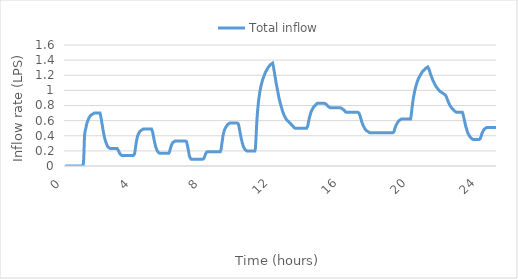
| Category | Total inflow |
|---|---|
| 0.0 | 0 |
| 0.016666666666666666 | 0 |
| 0.03333333333333333 | 0 |
| 0.05 | 0 |
| 0.06666666666666667 | 0 |
| 0.08333333333333333 | 0 |
| 0.09999999999999999 | 0 |
| 0.11666666666666665 | 0 |
| 0.13333333333333333 | 0 |
| 0.15 | 0 |
| 0.16666666666666666 | 0 |
| 0.18333333333333332 | 0 |
| 0.19999999999999998 | 0 |
| 0.21666666666666665 | 0 |
| 0.2333333333333333 | 0 |
| 0.24999999999999997 | 0 |
| 0.26666666666666666 | 0 |
| 0.2833333333333333 | 0 |
| 0.3 | 0 |
| 0.31666666666666665 | 0 |
| 0.3333333333333333 | 0 |
| 0.35 | 0 |
| 0.36666666666666664 | 0 |
| 0.3833333333333333 | 0 |
| 0.39999999999999997 | 0 |
| 0.41666666666666663 | 0 |
| 0.4333333333333333 | 0 |
| 0.44999999999999996 | 0 |
| 0.4666666666666666 | 0 |
| 0.4833333333333333 | 0 |
| 0.49999999999999994 | 0 |
| 0.5166666666666666 | 0 |
| 0.5333333333333333 | 0 |
| 0.55 | 0 |
| 0.5666666666666668 | 0 |
| 0.5833333333333335 | 0 |
| 0.6000000000000002 | 0 |
| 0.6166666666666669 | 0 |
| 0.6333333333333336 | 0 |
| 0.6500000000000004 | 0 |
| 0.6666666666666671 | 0 |
| 0.6833333333333338 | 0 |
| 0.7000000000000005 | 0 |
| 0.7166666666666672 | 0 |
| 0.733333333333334 | 0 |
| 0.7500000000000007 | 0 |
| 0.7666666666666674 | 0 |
| 0.7833333333333341 | 0 |
| 0.8000000000000008 | 0 |
| 0.8166666666666675 | 0 |
| 0.8333333333333343 | 0 |
| 0.850000000000001 | 0 |
| 0.8666666666666677 | 0 |
| 0.8833333333333344 | 0 |
| 0.9000000000000011 | 0 |
| 0.9166666666666679 | 0 |
| 0.9333333333333346 | 0 |
| 0.9500000000000013 | 0 |
| 0.966666666666668 | 0 |
| 0.9833333333333347 | 0 |
| 1.0000000000000013 | 0 |
| 1.016666666666668 | 0 |
| 1.0333333333333345 | 0.01 |
| 1.0500000000000012 | 0.02 |
| 1.0666666666666678 | 0.06 |
| 1.0833333333333344 | 0.14 |
| 1.100000000000001 | 0.25 |
| 1.1166666666666676 | 0.37 |
| 1.1333333333333342 | 0.43 |
| 1.1500000000000008 | 0.45 |
| 1.1666666666666674 | 0.47 |
| 1.183333333333334 | 0.48 |
| 1.2000000000000006 | 0.5 |
| 1.2166666666666672 | 0.52 |
| 1.2333333333333338 | 0.54 |
| 1.2500000000000004 | 0.55 |
| 1.266666666666667 | 0.57 |
| 1.2833333333333337 | 0.58 |
| 1.3000000000000003 | 0.59 |
| 1.3166666666666669 | 0.6 |
| 1.3333333333333335 | 0.61 |
| 1.35 | 0.62 |
| 1.3666666666666667 | 0.63 |
| 1.3833333333333333 | 0.63 |
| 1.4 | 0.64 |
| 1.4166666666666665 | 0.65 |
| 1.4333333333333331 | 0.65 |
| 1.4499999999999997 | 0.66 |
| 1.4666666666666663 | 0.66 |
| 1.483333333333333 | 0.67 |
| 1.4999999999999996 | 0.67 |
| 1.5166666666666662 | 0.68 |
| 1.5333333333333328 | 0.68 |
| 1.5499999999999994 | 0.68 |
| 1.566666666666666 | 0.69 |
| 1.5833333333333326 | 0.69 |
| 1.5999999999999992 | 0.69 |
| 1.6166666666666658 | 0.69 |
| 1.6333333333333324 | 0.7 |
| 1.649999999999999 | 0.7 |
| 1.6666666666666656 | 0.7 |
| 1.6833333333333322 | 0.7 |
| 1.6999999999999988 | 0.7 |
| 1.7166666666666655 | 0.7 |
| 1.733333333333332 | 0.7 |
| 1.7499999999999987 | 0.7 |
| 1.7666666666666653 | 0.7 |
| 1.7833333333333319 | 0.7 |
| 1.7999999999999985 | 0.7 |
| 1.816666666666665 | 0.7 |
| 1.8333333333333317 | 0.7 |
| 1.8499999999999983 | 0.7 |
| 1.866666666666665 | 0.7 |
| 1.8833333333333315 | 0.7 |
| 1.8999999999999981 | 0.7 |
| 1.9166666666666647 | 0.7 |
| 1.9333333333333313 | 0.7 |
| 1.949999999999998 | 0.7 |
| 1.9666666666666646 | 0.7 |
| 1.9833333333333312 | 0.7 |
| 1.9999999999999978 | 0.7 |
| 2.0166666666666644 | 0.7 |
| 2.033333333333331 | 0.69 |
| 2.0499999999999976 | 0.67 |
| 2.066666666666664 | 0.65 |
| 2.083333333333331 | 0.63 |
| 2.0999999999999974 | 0.61 |
| 2.116666666666664 | 0.58 |
| 2.1333333333333306 | 0.56 |
| 2.1499999999999972 | 0.54 |
| 2.166666666666664 | 0.52 |
| 2.1833333333333305 | 0.49 |
| 2.199999999999997 | 0.47 |
| 2.2166666666666637 | 0.45 |
| 2.2333333333333303 | 0.43 |
| 2.249999999999997 | 0.41 |
| 2.2666666666666635 | 0.39 |
| 2.28333333333333 | 0.38 |
| 2.2999999999999967 | 0.36 |
| 2.3166666666666633 | 0.35 |
| 2.33333333333333 | 0.33 |
| 2.3499999999999965 | 0.32 |
| 2.366666666666663 | 0.31 |
| 2.3833333333333298 | 0.3 |
| 2.3999999999999964 | 0.29 |
| 2.416666666666663 | 0.28 |
| 2.4333333333333296 | 0.27 |
| 2.449999999999996 | 0.26 |
| 2.466666666666663 | 0.26 |
| 2.4833333333333294 | 0.25 |
| 2.499999999999996 | 0.25 |
| 2.5166666666666626 | 0.25 |
| 2.533333333333329 | 0.24 |
| 2.549999999999996 | 0.24 |
| 2.5666666666666624 | 0.24 |
| 2.583333333333329 | 0.24 |
| 2.5999999999999956 | 0.23 |
| 2.6166666666666623 | 0.23 |
| 2.633333333333329 | 0.23 |
| 2.6499999999999955 | 0.23 |
| 2.666666666666662 | 0.23 |
| 2.6833333333333287 | 0.23 |
| 2.6999999999999953 | 0.23 |
| 2.716666666666662 | 0.23 |
| 2.7333333333333285 | 0.23 |
| 2.749999999999995 | 0.23 |
| 2.7666666666666617 | 0.23 |
| 2.7833333333333283 | 0.23 |
| 2.799999999999995 | 0.23 |
| 2.8166666666666615 | 0.23 |
| 2.833333333333328 | 0.23 |
| 2.8499999999999948 | 0.23 |
| 2.8666666666666614 | 0.23 |
| 2.883333333333328 | 0.23 |
| 2.8999999999999946 | 0.23 |
| 2.916666666666661 | 0.23 |
| 2.933333333333328 | 0.23 |
| 2.9499999999999944 | 0.23 |
| 2.966666666666661 | 0.23 |
| 2.9833333333333276 | 0.23 |
| 2.9999999999999942 | 0.23 |
| 3.016666666666661 | 0.23 |
| 3.0333333333333274 | 0.23 |
| 3.049999999999994 | 0.22 |
| 3.0666666666666607 | 0.21 |
| 3.0833333333333273 | 0.2 |
| 3.099999999999994 | 0.2 |
| 3.1166666666666605 | 0.19 |
| 3.133333333333327 | 0.18 |
| 3.1499999999999937 | 0.17 |
| 3.1666666666666603 | 0.17 |
| 3.183333333333327 | 0.16 |
| 3.1999999999999935 | 0.16 |
| 3.21666666666666 | 0.15 |
| 3.2333333333333267 | 0.15 |
| 3.2499999999999933 | 0.15 |
| 3.26666666666666 | 0.15 |
| 3.2833333333333266 | 0.14 |
| 3.299999999999993 | 0.14 |
| 3.3166666666666598 | 0.14 |
| 3.3333333333333264 | 0.14 |
| 3.349999999999993 | 0.14 |
| 3.3666666666666596 | 0.14 |
| 3.383333333333326 | 0.14 |
| 3.399999999999993 | 0.14 |
| 3.4166666666666594 | 0.14 |
| 3.433333333333326 | 0.14 |
| 3.4499999999999926 | 0.14 |
| 3.4666666666666592 | 0.14 |
| 3.483333333333326 | 0.14 |
| 3.4999999999999925 | 0.14 |
| 3.516666666666659 | 0.14 |
| 3.5333333333333257 | 0.14 |
| 3.5499999999999923 | 0.14 |
| 3.566666666666659 | 0.14 |
| 3.5833333333333255 | 0.14 |
| 3.599999999999992 | 0.14 |
| 3.6166666666666587 | 0.14 |
| 3.6333333333333253 | 0.14 |
| 3.649999999999992 | 0.14 |
| 3.6666666666666585 | 0.14 |
| 3.683333333333325 | 0.14 |
| 3.6999999999999917 | 0.14 |
| 3.7166666666666583 | 0.14 |
| 3.733333333333325 | 0.14 |
| 3.7499999999999916 | 0.14 |
| 3.766666666666658 | 0.14 |
| 3.7833333333333248 | 0.14 |
| 3.7999999999999914 | 0.14 |
| 3.816666666666658 | 0.14 |
| 3.8333333333333246 | 0.14 |
| 3.849999999999991 | 0.14 |
| 3.866666666666658 | 0.14 |
| 3.8833333333333244 | 0.14 |
| 3.899999999999991 | 0.14 |
| 3.9166666666666576 | 0.14 |
| 3.9333333333333242 | 0.14 |
| 3.949999999999991 | 0.14 |
| 3.9666666666666575 | 0.14 |
| 3.983333333333324 | 0.14 |
| 3.9999999999999907 | 0.15 |
| 4.016666666666658 | 0.16 |
| 4.033333333333324 | 0.17 |
| 4.049999999999991 | 0.2 |
| 4.0666666666666575 | 0.23 |
| 4.083333333333324 | 0.26 |
| 4.099999999999991 | 0.28 |
| 4.116666666666657 | 0.31 |
| 4.133333333333324 | 0.33 |
| 4.149999999999991 | 0.35 |
| 4.166666666666657 | 0.37 |
| 4.183333333333324 | 0.38 |
| 4.19999999999999 | 0.4 |
| 4.216666666666657 | 0.41 |
| 4.233333333333324 | 0.42 |
| 4.24999999999999 | 0.43 |
| 4.266666666666657 | 0.43 |
| 4.2833333333333234 | 0.44 |
| 4.29999999999999 | 0.45 |
| 4.316666666666657 | 0.45 |
| 4.333333333333323 | 0.46 |
| 4.34999999999999 | 0.46 |
| 4.3666666666666565 | 0.47 |
| 4.383333333333323 | 0.47 |
| 4.39999999999999 | 0.47 |
| 4.416666666666656 | 0.48 |
| 4.433333333333323 | 0.48 |
| 4.4499999999999895 | 0.48 |
| 4.466666666666656 | 0.48 |
| 4.483333333333323 | 0.49 |
| 4.499999999999989 | 0.49 |
| 4.516666666666656 | 0.49 |
| 4.533333333333323 | 0.49 |
| 4.549999999999989 | 0.49 |
| 4.566666666666656 | 0.49 |
| 4.583333333333322 | 0.49 |
| 4.599999999999989 | 0.49 |
| 4.616666666666656 | 0.49 |
| 4.633333333333322 | 0.49 |
| 4.649999999999989 | 0.49 |
| 4.666666666666655 | 0.49 |
| 4.683333333333322 | 0.49 |
| 4.699999999999989 | 0.49 |
| 4.716666666666655 | 0.49 |
| 4.733333333333322 | 0.49 |
| 4.7499999999999885 | 0.49 |
| 4.766666666666655 | 0.49 |
| 4.783333333333322 | 0.49 |
| 4.799999999999988 | 0.49 |
| 4.816666666666655 | 0.49 |
| 4.8333333333333215 | 0.49 |
| 4.849999999999988 | 0.49 |
| 4.866666666666655 | 0.49 |
| 4.883333333333321 | 0.49 |
| 4.899999999999988 | 0.49 |
| 4.9166666666666545 | 0.49 |
| 4.933333333333321 | 0.49 |
| 4.949999999999988 | 0.49 |
| 4.966666666666654 | 0.49 |
| 4.983333333333321 | 0.49 |
| 4.999999999999988 | 0.49 |
| 5.016666666666654 | 0.48 |
| 5.033333333333321 | 0.47 |
| 5.049999999999987 | 0.46 |
| 5.066666666666654 | 0.45 |
| 5.083333333333321 | 0.43 |
| 5.099999999999987 | 0.41 |
| 5.116666666666654 | 0.39 |
| 5.13333333333332 | 0.37 |
| 5.149999999999987 | 0.35 |
| 5.166666666666654 | 0.33 |
| 5.18333333333332 | 0.31 |
| 5.199999999999987 | 0.3 |
| 5.2166666666666535 | 0.28 |
| 5.23333333333332 | 0.26 |
| 5.249999999999987 | 0.25 |
| 5.266666666666653 | 0.24 |
| 5.28333333333332 | 0.23 |
| 5.2999999999999865 | 0.22 |
| 5.316666666666653 | 0.21 |
| 5.33333333333332 | 0.2 |
| 5.349999999999986 | 0.2 |
| 5.366666666666653 | 0.19 |
| 5.3833333333333195 | 0.19 |
| 5.399999999999986 | 0.18 |
| 5.416666666666653 | 0.18 |
| 5.433333333333319 | 0.18 |
| 5.449999999999986 | 0.18 |
| 5.466666666666653 | 0.17 |
| 5.483333333333319 | 0.17 |
| 5.499999999999986 | 0.17 |
| 5.516666666666652 | 0.17 |
| 5.533333333333319 | 0.17 |
| 5.549999999999986 | 0.17 |
| 5.566666666666652 | 0.17 |
| 5.583333333333319 | 0.17 |
| 5.599999999999985 | 0.17 |
| 5.616666666666652 | 0.17 |
| 5.633333333333319 | 0.17 |
| 5.649999999999985 | 0.17 |
| 5.666666666666652 | 0.17 |
| 5.6833333333333185 | 0.17 |
| 5.699999999999985 | 0.17 |
| 5.716666666666652 | 0.17 |
| 5.733333333333318 | 0.17 |
| 5.749999999999985 | 0.17 |
| 5.7666666666666515 | 0.17 |
| 5.783333333333318 | 0.17 |
| 5.799999999999985 | 0.17 |
| 5.816666666666651 | 0.17 |
| 5.833333333333318 | 0.17 |
| 5.8499999999999845 | 0.17 |
| 5.866666666666651 | 0.17 |
| 5.883333333333318 | 0.17 |
| 5.899999999999984 | 0.17 |
| 5.916666666666651 | 0.17 |
| 5.933333333333318 | 0.17 |
| 5.949999999999984 | 0.17 |
| 5.966666666666651 | 0.17 |
| 5.983333333333317 | 0.17 |
| 5.999999999999984 | 0.17 |
| 6.016666666666651 | 0.18 |
| 6.033333333333317 | 0.18 |
| 6.049999999999984 | 0.19 |
| 6.06666666666665 | 0.21 |
| 6.083333333333317 | 0.22 |
| 6.099999999999984 | 0.23 |
| 6.11666666666665 | 0.25 |
| 6.133333333333317 | 0.26 |
| 6.1499999999999835 | 0.27 |
| 6.16666666666665 | 0.28 |
| 6.183333333333317 | 0.29 |
| 6.199999999999983 | 0.29 |
| 6.21666666666665 | 0.3 |
| 6.2333333333333165 | 0.31 |
| 6.249999999999983 | 0.31 |
| 6.26666666666665 | 0.31 |
| 6.283333333333316 | 0.32 |
| 6.299999999999983 | 0.32 |
| 6.3166666666666496 | 0.32 |
| 6.333333333333316 | 0.32 |
| 6.349999999999983 | 0.33 |
| 6.366666666666649 | 0.33 |
| 6.383333333333316 | 0.33 |
| 6.399999999999983 | 0.33 |
| 6.416666666666649 | 0.33 |
| 6.433333333333316 | 0.33 |
| 6.449999999999982 | 0.33 |
| 6.466666666666649 | 0.33 |
| 6.483333333333316 | 0.33 |
| 6.499999999999982 | 0.33 |
| 6.516666666666649 | 0.33 |
| 6.5333333333333155 | 0.33 |
| 6.549999999999982 | 0.33 |
| 6.566666666666649 | 0.33 |
| 6.583333333333315 | 0.33 |
| 6.599999999999982 | 0.33 |
| 6.6166666666666485 | 0.33 |
| 6.633333333333315 | 0.33 |
| 6.649999999999982 | 0.33 |
| 6.666666666666648 | 0.33 |
| 6.683333333333315 | 0.33 |
| 6.6999999999999815 | 0.33 |
| 6.716666666666648 | 0.33 |
| 6.733333333333315 | 0.33 |
| 6.749999999999981 | 0.33 |
| 6.766666666666648 | 0.33 |
| 6.783333333333315 | 0.33 |
| 6.799999999999981 | 0.33 |
| 6.816666666666648 | 0.33 |
| 6.833333333333314 | 0.33 |
| 6.849999999999981 | 0.33 |
| 6.866666666666648 | 0.33 |
| 6.883333333333314 | 0.33 |
| 6.899999999999981 | 0.33 |
| 6.916666666666647 | 0.33 |
| 6.933333333333314 | 0.33 |
| 6.949999999999981 | 0.33 |
| 6.966666666666647 | 0.33 |
| 6.983333333333314 | 0.33 |
| 6.9999999999999805 | 0.33 |
| 7.016666666666647 | 0.32 |
| 7.033333333333314 | 0.32 |
| 7.04999999999998 | 0.3 |
| 7.066666666666647 | 0.29 |
| 7.0833333333333135 | 0.27 |
| 7.09999999999998 | 0.25 |
| 7.116666666666647 | 0.23 |
| 7.133333333333313 | 0.21 |
| 7.14999999999998 | 0.19 |
| 7.1666666666666465 | 0.17 |
| 7.183333333333313 | 0.15 |
| 7.19999999999998 | 0.13 |
| 7.216666666666646 | 0.12 |
| 7.233333333333313 | 0.11 |
| 7.24999999999998 | 0.11 |
| 7.266666666666646 | 0.1 |
| 7.283333333333313 | 0.1 |
| 7.299999999999979 | 0.09 |
| 7.316666666666646 | 0.09 |
| 7.333333333333313 | 0.09 |
| 7.349999999999979 | 0.09 |
| 7.366666666666646 | 0.09 |
| 7.383333333333312 | 0.09 |
| 7.399999999999979 | 0.09 |
| 7.416666666666646 | 0.09 |
| 7.433333333333312 | 0.09 |
| 7.449999999999979 | 0.09 |
| 7.4666666666666455 | 0.09 |
| 7.483333333333312 | 0.09 |
| 7.499999999999979 | 0.09 |
| 7.516666666666645 | 0.09 |
| 7.533333333333312 | 0.09 |
| 7.5499999999999785 | 0.09 |
| 7.566666666666645 | 0.09 |
| 7.583333333333312 | 0.09 |
| 7.599999999999978 | 0.09 |
| 7.616666666666645 | 0.09 |
| 7.6333333333333115 | 0.09 |
| 7.649999999999978 | 0.09 |
| 7.666666666666645 | 0.09 |
| 7.683333333333311 | 0.09 |
| 7.699999999999978 | 0.09 |
| 7.716666666666645 | 0.09 |
| 7.733333333333311 | 0.09 |
| 7.749999999999978 | 0.09 |
| 7.766666666666644 | 0.09 |
| 7.783333333333311 | 0.09 |
| 7.799999999999978 | 0.09 |
| 7.816666666666644 | 0.09 |
| 7.833333333333311 | 0.09 |
| 7.849999999999977 | 0.09 |
| 7.866666666666644 | 0.09 |
| 7.883333333333311 | 0.09 |
| 7.899999999999977 | 0.09 |
| 7.916666666666644 | 0.09 |
| 7.9333333333333105 | 0.09 |
| 7.949999999999977 | 0.09 |
| 7.966666666666644 | 0.09 |
| 7.98333333333331 | 0.09 |
| 7.999999999999977 | 0.09 |
| 8.016666666666644 | 0.09 |
| 8.033333333333312 | 0.1 |
| 8.04999999999998 | 0.11 |
| 8.066666666666647 | 0.12 |
| 8.083333333333314 | 0.13 |
| 8.099999999999982 | 0.14 |
| 8.11666666666665 | 0.15 |
| 8.133333333333317 | 0.16 |
| 8.149999999999984 | 0.17 |
| 8.166666666666652 | 0.17 |
| 8.18333333333332 | 0.18 |
| 8.199999999999987 | 0.18 |
| 8.216666666666654 | 0.18 |
| 8.233333333333322 | 0.19 |
| 8.24999999999999 | 0.19 |
| 8.266666666666657 | 0.19 |
| 8.283333333333324 | 0.19 |
| 8.299999999999992 | 0.19 |
| 8.31666666666666 | 0.19 |
| 8.333333333333327 | 0.19 |
| 8.349999999999994 | 0.19 |
| 8.366666666666662 | 0.19 |
| 8.38333333333333 | 0.19 |
| 8.399999999999997 | 0.19 |
| 8.416666666666664 | 0.19 |
| 8.433333333333332 | 0.19 |
| 8.45 | 0.19 |
| 8.466666666666667 | 0.19 |
| 8.483333333333334 | 0.19 |
| 8.500000000000002 | 0.19 |
| 8.51666666666667 | 0.19 |
| 8.533333333333337 | 0.19 |
| 8.550000000000004 | 0.19 |
| 8.566666666666672 | 0.19 |
| 8.58333333333334 | 0.19 |
| 8.600000000000007 | 0.19 |
| 8.616666666666674 | 0.19 |
| 8.633333333333342 | 0.19 |
| 8.65000000000001 | 0.19 |
| 8.666666666666677 | 0.19 |
| 8.683333333333344 | 0.19 |
| 8.700000000000012 | 0.19 |
| 8.71666666666668 | 0.19 |
| 8.733333333333347 | 0.19 |
| 8.750000000000014 | 0.19 |
| 8.766666666666682 | 0.19 |
| 8.78333333333335 | 0.19 |
| 8.800000000000017 | 0.19 |
| 8.816666666666684 | 0.19 |
| 8.833333333333352 | 0.19 |
| 8.85000000000002 | 0.19 |
| 8.866666666666687 | 0.19 |
| 8.883333333333354 | 0.19 |
| 8.900000000000022 | 0.19 |
| 8.91666666666669 | 0.19 |
| 8.933333333333357 | 0.19 |
| 8.950000000000024 | 0.19 |
| 8.966666666666692 | 0.19 |
| 8.98333333333336 | 0.19 |
| 9.000000000000027 | 0.19 |
| 9.016666666666694 | 0.2 |
| 9.033333333333362 | 0.22 |
| 9.05000000000003 | 0.25 |
| 9.066666666666697 | 0.28 |
| 9.083333333333364 | 0.31 |
| 9.100000000000032 | 0.33 |
| 9.1166666666667 | 0.36 |
| 9.133333333333367 | 0.39 |
| 9.150000000000034 | 0.41 |
| 9.166666666666702 | 0.42 |
| 9.183333333333369 | 0.44 |
| 9.200000000000037 | 0.45 |
| 9.216666666666704 | 0.47 |
| 9.233333333333372 | 0.48 |
| 9.250000000000039 | 0.49 |
| 9.266666666666707 | 0.5 |
| 9.283333333333374 | 0.5 |
| 9.300000000000042 | 0.51 |
| 9.316666666666709 | 0.52 |
| 9.333333333333377 | 0.52 |
| 9.350000000000044 | 0.53 |
| 9.366666666666712 | 0.54 |
| 9.383333333333379 | 0.54 |
| 9.400000000000047 | 0.54 |
| 9.416666666666714 | 0.55 |
| 9.433333333333382 | 0.55 |
| 9.450000000000049 | 0.55 |
| 9.466666666666717 | 0.56 |
| 9.483333333333384 | 0.56 |
| 9.500000000000052 | 0.56 |
| 9.516666666666719 | 0.57 |
| 9.533333333333387 | 0.57 |
| 9.550000000000054 | 0.57 |
| 9.566666666666721 | 0.57 |
| 9.583333333333389 | 0.57 |
| 9.600000000000056 | 0.57 |
| 9.616666666666724 | 0.57 |
| 9.633333333333391 | 0.57 |
| 9.650000000000059 | 0.57 |
| 9.666666666666726 | 0.57 |
| 9.683333333333394 | 0.57 |
| 9.700000000000061 | 0.57 |
| 9.716666666666729 | 0.57 |
| 9.733333333333396 | 0.57 |
| 9.750000000000064 | 0.57 |
| 9.766666666666731 | 0.57 |
| 9.783333333333399 | 0.57 |
| 9.800000000000066 | 0.57 |
| 9.816666666666734 | 0.57 |
| 9.833333333333401 | 0.57 |
| 9.850000000000069 | 0.57 |
| 9.866666666666736 | 0.57 |
| 9.883333333333404 | 0.57 |
| 9.900000000000071 | 0.57 |
| 9.916666666666739 | 0.57 |
| 9.933333333333406 | 0.57 |
| 9.950000000000074 | 0.57 |
| 9.966666666666741 | 0.57 |
| 9.983333333333409 | 0.57 |
| 10.000000000000076 | 0.57 |
| 10.016666666666744 | 0.56 |
| 10.033333333333411 | 0.55 |
| 10.050000000000079 | 0.54 |
| 10.066666666666746 | 0.52 |
| 10.083333333333414 | 0.5 |
| 10.100000000000081 | 0.48 |
| 10.116666666666749 | 0.46 |
| 10.133333333333416 | 0.44 |
| 10.150000000000084 | 0.42 |
| 10.166666666666751 | 0.4 |
| 10.183333333333419 | 0.38 |
| 10.200000000000086 | 0.36 |
| 10.216666666666754 | 0.35 |
| 10.233333333333421 | 0.33 |
| 10.250000000000089 | 0.31 |
| 10.266666666666756 | 0.3 |
| 10.283333333333424 | 0.29 |
| 10.300000000000091 | 0.27 |
| 10.316666666666759 | 0.26 |
| 10.333333333333426 | 0.25 |
| 10.350000000000094 | 0.24 |
| 10.366666666666761 | 0.24 |
| 10.383333333333429 | 0.23 |
| 10.400000000000096 | 0.23 |
| 10.416666666666764 | 0.22 |
| 10.433333333333431 | 0.22 |
| 10.450000000000099 | 0.21 |
| 10.466666666666766 | 0.21 |
| 10.483333333333434 | 0.21 |
| 10.500000000000101 | 0.21 |
| 10.516666666666769 | 0.2 |
| 10.533333333333436 | 0.2 |
| 10.550000000000104 | 0.2 |
| 10.566666666666771 | 0.2 |
| 10.583333333333439 | 0.2 |
| 10.600000000000106 | 0.2 |
| 10.616666666666774 | 0.2 |
| 10.633333333333441 | 0.2 |
| 10.650000000000109 | 0.2 |
| 10.666666666666776 | 0.2 |
| 10.683333333333444 | 0.2 |
| 10.700000000000111 | 0.2 |
| 10.716666666666779 | 0.2 |
| 10.733333333333446 | 0.2 |
| 10.750000000000114 | 0.2 |
| 10.766666666666781 | 0.2 |
| 10.783333333333449 | 0.2 |
| 10.800000000000116 | 0.2 |
| 10.816666666666784 | 0.2 |
| 10.833333333333451 | 0.2 |
| 10.850000000000119 | 0.2 |
| 10.866666666666786 | 0.2 |
| 10.883333333333454 | 0.2 |
| 10.900000000000121 | 0.2 |
| 10.916666666666789 | 0.2 |
| 10.933333333333456 | 0.2 |
| 10.950000000000124 | 0.2 |
| 10.966666666666791 | 0.2 |
| 10.983333333333459 | 0.2 |
| 11.000000000000126 | 0.21 |
| 11.016666666666794 | 0.23 |
| 11.033333333333461 | 0.29 |
| 11.050000000000129 | 0.36 |
| 11.066666666666796 | 0.44 |
| 11.083333333333464 | 0.52 |
| 11.100000000000131 | 0.58 |
| 11.116666666666799 | 0.64 |
| 11.133333333333466 | 0.7 |
| 11.150000000000134 | 0.74 |
| 11.166666666666801 | 0.78 |
| 11.183333333333469 | 0.82 |
| 11.200000000000136 | 0.86 |
| 11.216666666666804 | 0.89 |
| 11.233333333333471 | 0.91 |
| 11.250000000000139 | 0.94 |
| 11.266666666666806 | 0.97 |
| 11.283333333333474 | 0.99 |
| 11.300000000000141 | 1.01 |
| 11.316666666666809 | 1.03 |
| 11.333333333333476 | 1.05 |
| 11.350000000000144 | 1.06 |
| 11.366666666666811 | 1.08 |
| 11.383333333333479 | 1.09 |
| 11.400000000000146 | 1.11 |
| 11.416666666666814 | 1.12 |
| 11.433333333333481 | 1.14 |
| 11.450000000000149 | 1.15 |
| 11.466666666666816 | 1.16 |
| 11.483333333333483 | 1.17 |
| 11.500000000000151 | 1.18 |
| 11.516666666666818 | 1.19 |
| 11.533333333333486 | 1.2 |
| 11.550000000000153 | 1.21 |
| 11.566666666666821 | 1.22 |
| 11.583333333333488 | 1.23 |
| 11.600000000000156 | 1.24 |
| 11.616666666666823 | 1.25 |
| 11.633333333333491 | 1.25 |
| 11.650000000000158 | 1.26 |
| 11.666666666666826 | 1.27 |
| 11.683333333333493 | 1.27 |
| 11.700000000000161 | 1.28 |
| 11.716666666666828 | 1.29 |
| 11.733333333333496 | 1.29 |
| 11.750000000000163 | 1.3 |
| 11.766666666666831 | 1.3 |
| 11.783333333333498 | 1.31 |
| 11.800000000000166 | 1.31 |
| 11.816666666666833 | 1.32 |
| 11.833333333333501 | 1.32 |
| 11.850000000000168 | 1.33 |
| 11.866666666666836 | 1.33 |
| 11.883333333333503 | 1.34 |
| 11.90000000000017 | 1.34 |
| 11.916666666666838 | 1.35 |
| 11.933333333333506 | 1.35 |
| 11.950000000000173 | 1.35 |
| 11.96666666666684 | 1.36 |
| 11.983333333333508 | 1.36 |
| 12.000000000000176 | 1.36 |
| 12.016666666666843 | 1.36 |
| 12.03333333333351 | 1.34 |
| 12.050000000000178 | 1.33 |
| 12.066666666666846 | 1.31 |
| 12.083333333333513 | 1.28 |
| 12.10000000000018 | 1.26 |
| 12.116666666666848 | 1.24 |
| 12.133333333333516 | 1.21 |
| 12.150000000000183 | 1.19 |
| 12.16666666666685 | 1.17 |
| 12.183333333333518 | 1.15 |
| 12.200000000000186 | 1.12 |
| 12.216666666666853 | 1.1 |
| 12.23333333333352 | 1.08 |
| 12.250000000000188 | 1.06 |
| 12.266666666666856 | 1.04 |
| 12.283333333333523 | 1.02 |
| 12.30000000000019 | 1 |
| 12.316666666666858 | 0.98 |
| 12.333333333333526 | 0.96 |
| 12.350000000000193 | 0.94 |
| 12.36666666666686 | 0.92 |
| 12.383333333333528 | 0.9 |
| 12.400000000000196 | 0.89 |
| 12.416666666666863 | 0.87 |
| 12.43333333333353 | 0.86 |
| 12.450000000000198 | 0.84 |
| 12.466666666666866 | 0.82 |
| 12.483333333333533 | 0.81 |
| 12.5000000000002 | 0.8 |
| 12.516666666666868 | 0.78 |
| 12.533333333333536 | 0.77 |
| 12.550000000000203 | 0.76 |
| 12.56666666666687 | 0.74 |
| 12.583333333333538 | 0.73 |
| 12.600000000000206 | 0.72 |
| 12.616666666666873 | 0.71 |
| 12.63333333333354 | 0.7 |
| 12.650000000000208 | 0.69 |
| 12.666666666666876 | 0.68 |
| 12.683333333333543 | 0.67 |
| 12.70000000000021 | 0.66 |
| 12.716666666666878 | 0.66 |
| 12.733333333333546 | 0.65 |
| 12.750000000000213 | 0.64 |
| 12.76666666666688 | 0.64 |
| 12.783333333333548 | 0.63 |
| 12.800000000000216 | 0.62 |
| 12.816666666666883 | 0.62 |
| 12.83333333333355 | 0.61 |
| 12.850000000000218 | 0.61 |
| 12.866666666666886 | 0.6 |
| 12.883333333333553 | 0.6 |
| 12.90000000000022 | 0.59 |
| 12.916666666666888 | 0.59 |
| 12.933333333333556 | 0.59 |
| 12.950000000000223 | 0.58 |
| 12.96666666666689 | 0.58 |
| 12.983333333333558 | 0.58 |
| 13.000000000000226 | 0.57 |
| 13.016666666666893 | 0.57 |
| 13.03333333333356 | 0.57 |
| 13.050000000000228 | 0.56 |
| 13.066666666666896 | 0.56 |
| 13.083333333333563 | 0.55 |
| 13.10000000000023 | 0.55 |
| 13.116666666666898 | 0.54 |
| 13.133333333333566 | 0.54 |
| 13.150000000000233 | 0.53 |
| 13.1666666666669 | 0.53 |
| 13.183333333333568 | 0.53 |
| 13.200000000000236 | 0.52 |
| 13.216666666666903 | 0.52 |
| 13.23333333333357 | 0.52 |
| 13.250000000000238 | 0.51 |
| 13.266666666666906 | 0.51 |
| 13.283333333333573 | 0.51 |
| 13.30000000000024 | 0.51 |
| 13.316666666666908 | 0.5 |
| 13.333333333333576 | 0.5 |
| 13.350000000000243 | 0.5 |
| 13.36666666666691 | 0.5 |
| 13.383333333333578 | 0.5 |
| 13.400000000000245 | 0.5 |
| 13.416666666666913 | 0.5 |
| 13.43333333333358 | 0.5 |
| 13.450000000000248 | 0.5 |
| 13.466666666666915 | 0.5 |
| 13.483333333333583 | 0.5 |
| 13.50000000000025 | 0.5 |
| 13.516666666666918 | 0.5 |
| 13.533333333333585 | 0.5 |
| 13.550000000000253 | 0.5 |
| 13.56666666666692 | 0.5 |
| 13.583333333333588 | 0.5 |
| 13.600000000000255 | 0.5 |
| 13.616666666666923 | 0.5 |
| 13.63333333333359 | 0.5 |
| 13.650000000000258 | 0.5 |
| 13.666666666666925 | 0.5 |
| 13.683333333333593 | 0.5 |
| 13.70000000000026 | 0.5 |
| 13.716666666666928 | 0.5 |
| 13.733333333333595 | 0.5 |
| 13.750000000000263 | 0.5 |
| 13.76666666666693 | 0.5 |
| 13.783333333333598 | 0.5 |
| 13.800000000000265 | 0.5 |
| 13.816666666666933 | 0.5 |
| 13.8333333333336 | 0.5 |
| 13.850000000000268 | 0.5 |
| 13.866666666666935 | 0.5 |
| 13.883333333333603 | 0.5 |
| 13.90000000000027 | 0.5 |
| 13.916666666666938 | 0.5 |
| 13.933333333333605 | 0.5 |
| 13.950000000000273 | 0.5 |
| 13.96666666666694 | 0.5 |
| 13.983333333333608 | 0.5 |
| 14.000000000000275 | 0.5 |
| 14.016666666666943 | 0.51 |
| 14.03333333333361 | 0.52 |
| 14.050000000000278 | 0.53 |
| 14.066666666666945 | 0.55 |
| 14.083333333333613 | 0.57 |
| 14.10000000000028 | 0.59 |
| 14.116666666666948 | 0.61 |
| 14.133333333333615 | 0.63 |
| 14.150000000000283 | 0.64 |
| 14.16666666666695 | 0.66 |
| 14.183333333333618 | 0.67 |
| 14.200000000000285 | 0.68 |
| 14.216666666666953 | 0.69 |
| 14.23333333333362 | 0.71 |
| 14.250000000000288 | 0.72 |
| 14.266666666666955 | 0.73 |
| 14.283333333333623 | 0.73 |
| 14.30000000000029 | 0.74 |
| 14.316666666666958 | 0.75 |
| 14.333333333333625 | 0.76 |
| 14.350000000000293 | 0.76 |
| 14.36666666666696 | 0.77 |
| 14.383333333333628 | 0.78 |
| 14.400000000000295 | 0.78 |
| 14.416666666666963 | 0.79 |
| 14.43333333333363 | 0.79 |
| 14.450000000000298 | 0.8 |
| 14.466666666666965 | 0.8 |
| 14.483333333333633 | 0.8 |
| 14.5000000000003 | 0.81 |
| 14.516666666666968 | 0.81 |
| 14.533333333333635 | 0.81 |
| 14.550000000000303 | 0.82 |
| 14.56666666666697 | 0.82 |
| 14.583333333333638 | 0.82 |
| 14.600000000000305 | 0.83 |
| 14.616666666666973 | 0.83 |
| 14.63333333333364 | 0.83 |
| 14.650000000000308 | 0.83 |
| 14.666666666666975 | 0.83 |
| 14.683333333333643 | 0.83 |
| 14.70000000000031 | 0.83 |
| 14.716666666666978 | 0.83 |
| 14.733333333333645 | 0.83 |
| 14.750000000000313 | 0.83 |
| 14.76666666666698 | 0.83 |
| 14.783333333333648 | 0.83 |
| 14.800000000000315 | 0.83 |
| 14.816666666666983 | 0.83 |
| 14.83333333333365 | 0.83 |
| 14.850000000000318 | 0.83 |
| 14.866666666666985 | 0.83 |
| 14.883333333333653 | 0.83 |
| 14.90000000000032 | 0.83 |
| 14.916666666666988 | 0.83 |
| 14.933333333333655 | 0.83 |
| 14.950000000000323 | 0.83 |
| 14.96666666666699 | 0.83 |
| 14.983333333333658 | 0.83 |
| 15.000000000000325 | 0.83 |
| 15.016666666666993 | 0.83 |
| 15.03333333333366 | 0.83 |
| 15.050000000000328 | 0.83 |
| 15.066666666666995 | 0.83 |
| 15.083333333333663 | 0.82 |
| 15.10000000000033 | 0.82 |
| 15.116666666666998 | 0.82 |
| 15.133333333333665 | 0.81 |
| 15.150000000000333 | 0.81 |
| 15.166666666667 | 0.81 |
| 15.183333333333668 | 0.8 |
| 15.200000000000335 | 0.8 |
| 15.216666666667003 | 0.79 |
| 15.23333333333367 | 0.79 |
| 15.250000000000338 | 0.79 |
| 15.266666666667005 | 0.79 |
| 15.283333333333672 | 0.78 |
| 15.30000000000034 | 0.78 |
| 15.316666666667007 | 0.78 |
| 15.333333333333675 | 0.78 |
| 15.350000000000342 | 0.77 |
| 15.36666666666701 | 0.77 |
| 15.383333333333677 | 0.77 |
| 15.400000000000345 | 0.77 |
| 15.416666666667012 | 0.77 |
| 15.43333333333368 | 0.77 |
| 15.450000000000347 | 0.77 |
| 15.466666666667015 | 0.77 |
| 15.483333333333682 | 0.77 |
| 15.50000000000035 | 0.77 |
| 15.516666666667017 | 0.77 |
| 15.533333333333685 | 0.77 |
| 15.550000000000352 | 0.77 |
| 15.56666666666702 | 0.77 |
| 15.583333333333687 | 0.77 |
| 15.600000000000355 | 0.77 |
| 15.616666666667022 | 0.77 |
| 15.63333333333369 | 0.77 |
| 15.650000000000357 | 0.77 |
| 15.666666666667025 | 0.77 |
| 15.683333333333692 | 0.77 |
| 15.70000000000036 | 0.77 |
| 15.716666666667027 | 0.77 |
| 15.733333333333695 | 0.77 |
| 15.750000000000362 | 0.77 |
| 15.76666666666703 | 0.77 |
| 15.783333333333697 | 0.77 |
| 15.800000000000365 | 0.77 |
| 15.816666666667032 | 0.77 |
| 15.8333333333337 | 0.77 |
| 15.850000000000367 | 0.77 |
| 15.866666666667035 | 0.77 |
| 15.883333333333702 | 0.77 |
| 15.90000000000037 | 0.77 |
| 15.916666666667037 | 0.77 |
| 15.933333333333705 | 0.77 |
| 15.950000000000372 | 0.77 |
| 15.96666666666704 | 0.77 |
| 15.983333333333707 | 0.77 |
| 16.000000000000373 | 0.77 |
| 16.01666666666704 | 0.76 |
| 16.033333333333704 | 0.76 |
| 16.05000000000037 | 0.76 |
| 16.066666666667036 | 0.75 |
| 16.0833333333337 | 0.75 |
| 16.100000000000367 | 0.75 |
| 16.116666666667033 | 0.74 |
| 16.1333333333337 | 0.74 |
| 16.150000000000365 | 0.74 |
| 16.16666666666703 | 0.73 |
| 16.183333333333696 | 0.73 |
| 16.20000000000036 | 0.73 |
| 16.216666666667027 | 0.72 |
| 16.233333333333693 | 0.72 |
| 16.25000000000036 | 0.72 |
| 16.266666666667025 | 0.72 |
| 16.28333333333369 | 0.71 |
| 16.300000000000356 | 0.71 |
| 16.31666666666702 | 0.71 |
| 16.333333333333687 | 0.71 |
| 16.350000000000353 | 0.71 |
| 16.36666666666702 | 0.71 |
| 16.383333333333685 | 0.71 |
| 16.40000000000035 | 0.71 |
| 16.416666666667016 | 0.71 |
| 16.43333333333368 | 0.71 |
| 16.450000000000347 | 0.71 |
| 16.466666666667013 | 0.71 |
| 16.48333333333368 | 0.71 |
| 16.500000000000345 | 0.71 |
| 16.51666666666701 | 0.71 |
| 16.533333333333676 | 0.71 |
| 16.55000000000034 | 0.71 |
| 16.566666666667007 | 0.71 |
| 16.583333333333673 | 0.71 |
| 16.60000000000034 | 0.71 |
| 16.616666666667005 | 0.71 |
| 16.63333333333367 | 0.71 |
| 16.650000000000336 | 0.71 |
| 16.666666666667002 | 0.71 |
| 16.683333333333668 | 0.71 |
| 16.700000000000333 | 0.71 |
| 16.716666666667 | 0.71 |
| 16.733333333333665 | 0.71 |
| 16.75000000000033 | 0.71 |
| 16.766666666666996 | 0.71 |
| 16.783333333333662 | 0.71 |
| 16.800000000000328 | 0.71 |
| 16.816666666666993 | 0.71 |
| 16.83333333333366 | 0.71 |
| 16.850000000000325 | 0.71 |
| 16.86666666666699 | 0.71 |
| 16.883333333333656 | 0.71 |
| 16.900000000000322 | 0.71 |
| 16.916666666666988 | 0.71 |
| 16.933333333333653 | 0.71 |
| 16.95000000000032 | 0.71 |
| 16.966666666666985 | 0.71 |
| 16.98333333333365 | 0.71 |
| 17.000000000000316 | 0.71 |
| 17.016666666666982 | 0.7 |
| 17.033333333333648 | 0.69 |
| 17.050000000000313 | 0.68 |
| 17.06666666666698 | 0.67 |
| 17.083333333333645 | 0.66 |
| 17.10000000000031 | 0.65 |
| 17.116666666666976 | 0.63 |
| 17.133333333333642 | 0.62 |
| 17.150000000000308 | 0.61 |
| 17.166666666666973 | 0.59 |
| 17.18333333333364 | 0.58 |
| 17.200000000000305 | 0.57 |
| 17.21666666666697 | 0.56 |
| 17.233333333333636 | 0.55 |
| 17.250000000000302 | 0.54 |
| 17.266666666666968 | 0.53 |
| 17.283333333333633 | 0.52 |
| 17.3000000000003 | 0.52 |
| 17.316666666666965 | 0.51 |
| 17.33333333333363 | 0.5 |
| 17.350000000000296 | 0.5 |
| 17.366666666666962 | 0.49 |
| 17.383333333333628 | 0.49 |
| 17.400000000000293 | 0.48 |
| 17.41666666666696 | 0.48 |
| 17.433333333333625 | 0.47 |
| 17.45000000000029 | 0.47 |
| 17.466666666666956 | 0.46 |
| 17.483333333333622 | 0.46 |
| 17.500000000000288 | 0.46 |
| 17.516666666666953 | 0.45 |
| 17.53333333333362 | 0.45 |
| 17.550000000000285 | 0.45 |
| 17.56666666666695 | 0.45 |
| 17.583333333333616 | 0.44 |
| 17.600000000000282 | 0.44 |
| 17.616666666666948 | 0.44 |
| 17.633333333333614 | 0.44 |
| 17.65000000000028 | 0.44 |
| 17.666666666666945 | 0.44 |
| 17.68333333333361 | 0.44 |
| 17.700000000000276 | 0.44 |
| 17.716666666666942 | 0.44 |
| 17.733333333333608 | 0.44 |
| 17.750000000000274 | 0.44 |
| 17.76666666666694 | 0.44 |
| 17.783333333333605 | 0.44 |
| 17.80000000000027 | 0.44 |
| 17.816666666666936 | 0.44 |
| 17.833333333333602 | 0.44 |
| 17.850000000000268 | 0.44 |
| 17.866666666666934 | 0.44 |
| 17.8833333333336 | 0.44 |
| 17.900000000000265 | 0.44 |
| 17.91666666666693 | 0.44 |
| 17.933333333333596 | 0.44 |
| 17.950000000000262 | 0.44 |
| 17.966666666666928 | 0.44 |
| 17.983333333333594 | 0.44 |
| 18.00000000000026 | 0.44 |
| 18.016666666666925 | 0.44 |
| 18.03333333333359 | 0.44 |
| 18.050000000000257 | 0.44 |
| 18.066666666666922 | 0.44 |
| 18.083333333333588 | 0.44 |
| 18.100000000000254 | 0.44 |
| 18.11666666666692 | 0.44 |
| 18.133333333333585 | 0.44 |
| 18.15000000000025 | 0.44 |
| 18.166666666666917 | 0.44 |
| 18.183333333333582 | 0.44 |
| 18.200000000000248 | 0.44 |
| 18.216666666666914 | 0.44 |
| 18.23333333333358 | 0.44 |
| 18.250000000000245 | 0.44 |
| 18.26666666666691 | 0.44 |
| 18.283333333333577 | 0.44 |
| 18.300000000000242 | 0.44 |
| 18.316666666666908 | 0.44 |
| 18.333333333333574 | 0.44 |
| 18.35000000000024 | 0.44 |
| 18.366666666666905 | 0.44 |
| 18.38333333333357 | 0.44 |
| 18.400000000000237 | 0.44 |
| 18.416666666666902 | 0.44 |
| 18.433333333333568 | 0.44 |
| 18.450000000000234 | 0.44 |
| 18.4666666666669 | 0.44 |
| 18.483333333333565 | 0.44 |
| 18.50000000000023 | 0.44 |
| 18.516666666666897 | 0.44 |
| 18.533333333333562 | 0.44 |
| 18.550000000000228 | 0.44 |
| 18.566666666666894 | 0.44 |
| 18.58333333333356 | 0.44 |
| 18.600000000000225 | 0.44 |
| 18.61666666666689 | 0.44 |
| 18.633333333333557 | 0.44 |
| 18.650000000000222 | 0.44 |
| 18.666666666666888 | 0.44 |
| 18.683333333333554 | 0.44 |
| 18.70000000000022 | 0.44 |
| 18.716666666666885 | 0.44 |
| 18.73333333333355 | 0.44 |
| 18.750000000000217 | 0.44 |
| 18.766666666666882 | 0.44 |
| 18.783333333333548 | 0.44 |
| 18.800000000000214 | 0.44 |
| 18.81666666666688 | 0.44 |
| 18.833333333333545 | 0.44 |
| 18.85000000000021 | 0.44 |
| 18.866666666666877 | 0.44 |
| 18.883333333333542 | 0.44 |
| 18.900000000000208 | 0.44 |
| 18.916666666666874 | 0.44 |
| 18.93333333333354 | 0.44 |
| 18.950000000000205 | 0.44 |
| 18.96666666666687 | 0.44 |
| 18.983333333333537 | 0.44 |
| 19.000000000000203 | 0.44 |
| 19.01666666666687 | 0.45 |
| 19.033333333333534 | 0.45 |
| 19.0500000000002 | 0.46 |
| 19.066666666666865 | 0.47 |
| 19.08333333333353 | 0.48 |
| 19.100000000000197 | 0.5 |
| 19.116666666666863 | 0.51 |
| 19.13333333333353 | 0.52 |
| 19.150000000000194 | 0.53 |
| 19.16666666666686 | 0.54 |
| 19.183333333333525 | 0.55 |
| 19.20000000000019 | 0.55 |
| 19.216666666666857 | 0.56 |
| 19.233333333333523 | 0.57 |
| 19.25000000000019 | 0.57 |
| 19.266666666666854 | 0.58 |
| 19.28333333333352 | 0.58 |
| 19.300000000000185 | 0.59 |
| 19.31666666666685 | 0.59 |
| 19.333333333333517 | 0.6 |
| 19.350000000000183 | 0.6 |
| 19.36666666666685 | 0.6 |
| 19.383333333333514 | 0.61 |
| 19.40000000000018 | 0.61 |
| 19.416666666666845 | 0.61 |
| 19.43333333333351 | 0.62 |
| 19.450000000000177 | 0.62 |
| 19.466666666666843 | 0.62 |
| 19.48333333333351 | 0.62 |
| 19.500000000000174 | 0.62 |
| 19.51666666666684 | 0.62 |
| 19.533333333333506 | 0.62 |
| 19.55000000000017 | 0.62 |
| 19.566666666666837 | 0.62 |
| 19.583333333333503 | 0.62 |
| 19.60000000000017 | 0.62 |
| 19.616666666666834 | 0.62 |
| 19.6333333333335 | 0.62 |
| 19.650000000000166 | 0.62 |
| 19.66666666666683 | 0.62 |
| 19.683333333333497 | 0.62 |
| 19.700000000000163 | 0.62 |
| 19.71666666666683 | 0.62 |
| 19.733333333333494 | 0.62 |
| 19.75000000000016 | 0.62 |
| 19.766666666666826 | 0.62 |
| 19.78333333333349 | 0.62 |
| 19.800000000000157 | 0.62 |
| 19.816666666666823 | 0.62 |
| 19.83333333333349 | 0.62 |
| 19.850000000000154 | 0.62 |
| 19.86666666666682 | 0.62 |
| 19.883333333333486 | 0.62 |
| 19.90000000000015 | 0.62 |
| 19.916666666666817 | 0.62 |
| 19.933333333333483 | 0.62 |
| 19.95000000000015 | 0.62 |
| 19.966666666666814 | 0.62 |
| 19.98333333333348 | 0.62 |
| 20.000000000000146 | 0.62 |
| 20.01666666666681 | 0.64 |
| 20.033333333333477 | 0.66 |
| 20.050000000000143 | 0.69 |
| 20.06666666666681 | 0.72 |
| 20.083333333333474 | 0.76 |
| 20.10000000000014 | 0.79 |
| 20.116666666666806 | 0.82 |
| 20.13333333333347 | 0.85 |
| 20.150000000000137 | 0.87 |
| 20.166666666666803 | 0.9 |
| 20.18333333333347 | 0.92 |
| 20.200000000000134 | 0.94 |
| 20.2166666666668 | 0.96 |
| 20.233333333333466 | 0.98 |
| 20.25000000000013 | 1 |
| 20.266666666666797 | 1.01 |
| 20.283333333333463 | 1.03 |
| 20.30000000000013 | 1.04 |
| 20.316666666666794 | 1.06 |
| 20.33333333333346 | 1.07 |
| 20.350000000000126 | 1.08 |
| 20.36666666666679 | 1.1 |
| 20.383333333333457 | 1.11 |
| 20.400000000000123 | 1.12 |
| 20.41666666666679 | 1.13 |
| 20.433333333333454 | 1.14 |
| 20.45000000000012 | 1.15 |
| 20.466666666666786 | 1.16 |
| 20.48333333333345 | 1.16 |
| 20.500000000000117 | 1.17 |
| 20.516666666666783 | 1.18 |
| 20.53333333333345 | 1.19 |
| 20.550000000000114 | 1.19 |
| 20.56666666666678 | 1.2 |
| 20.583333333333446 | 1.21 |
| 20.60000000000011 | 1.21 |
| 20.616666666666777 | 1.22 |
| 20.633333333333443 | 1.23 |
| 20.65000000000011 | 1.23 |
| 20.666666666666774 | 1.24 |
| 20.68333333333344 | 1.24 |
| 20.700000000000106 | 1.25 |
| 20.71666666666677 | 1.25 |
| 20.733333333333437 | 1.26 |
| 20.750000000000103 | 1.26 |
| 20.76666666666677 | 1.26 |
| 20.783333333333434 | 1.27 |
| 20.8000000000001 | 1.27 |
| 20.816666666666766 | 1.28 |
| 20.83333333333343 | 1.28 |
| 20.850000000000097 | 1.28 |
| 20.866666666666763 | 1.29 |
| 20.88333333333343 | 1.29 |
| 20.900000000000095 | 1.29 |
| 20.91666666666676 | 1.3 |
| 20.933333333333426 | 1.3 |
| 20.95000000000009 | 1.3 |
| 20.966666666666757 | 1.3 |
| 20.983333333333423 | 1.31 |
| 21.00000000000009 | 1.31 |
| 21.016666666666755 | 1.31 |
| 21.03333333333342 | 1.3 |
| 21.050000000000086 | 1.29 |
| 21.06666666666675 | 1.28 |
| 21.083333333333417 | 1.27 |
| 21.100000000000083 | 1.26 |
| 21.11666666666675 | 1.25 |
| 21.133333333333415 | 1.23 |
| 21.15000000000008 | 1.22 |
| 21.166666666666746 | 1.21 |
| 21.18333333333341 | 1.2 |
| 21.200000000000077 | 1.19 |
| 21.216666666666743 | 1.18 |
| 21.23333333333341 | 1.17 |
| 21.250000000000075 | 1.16 |
| 21.26666666666674 | 1.15 |
| 21.283333333333406 | 1.14 |
| 21.30000000000007 | 1.13 |
| 21.316666666666737 | 1.13 |
| 21.333333333333403 | 1.12 |
| 21.35000000000007 | 1.11 |
| 21.366666666666735 | 1.1 |
| 21.3833333333334 | 1.09 |
| 21.400000000000066 | 1.09 |
| 21.416666666666732 | 1.08 |
| 21.433333333333398 | 1.07 |
| 21.450000000000063 | 1.07 |
| 21.46666666666673 | 1.06 |
| 21.483333333333395 | 1.05 |
| 21.50000000000006 | 1.05 |
| 21.516666666666726 | 1.04 |
| 21.533333333333392 | 1.04 |
| 21.550000000000058 | 1.03 |
| 21.566666666666723 | 1.03 |
| 21.58333333333339 | 1.02 |
| 21.600000000000055 | 1.02 |
| 21.61666666666672 | 1.01 |
| 21.633333333333386 | 1.01 |
| 21.650000000000052 | 1 |
| 21.666666666666718 | 1 |
| 21.683333333333383 | 0.99 |
| 21.70000000000005 | 0.99 |
| 21.716666666666715 | 0.99 |
| 21.73333333333338 | 0.98 |
| 21.750000000000046 | 0.98 |
| 21.766666666666712 | 0.98 |
| 21.783333333333378 | 0.97 |
| 21.800000000000043 | 0.97 |
| 21.81666666666671 | 0.97 |
| 21.833333333333375 | 0.96 |
| 21.85000000000004 | 0.96 |
| 21.866666666666706 | 0.96 |
| 21.883333333333372 | 0.96 |
| 21.900000000000038 | 0.95 |
| 21.916666666666703 | 0.95 |
| 21.93333333333337 | 0.95 |
| 21.950000000000035 | 0.95 |
| 21.9666666666667 | 0.95 |
| 21.983333333333366 | 0.95 |
| 22.000000000000032 | 0.95 |
| 22.016666666666698 | 0.94 |
| 22.033333333333363 | 0.93 |
| 22.05000000000003 | 0.93 |
| 22.066666666666695 | 0.92 |
| 22.08333333333336 | 0.91 |
| 22.100000000000026 | 0.9 |
| 22.116666666666692 | 0.89 |
| 22.133333333333358 | 0.88 |
| 22.150000000000023 | 0.87 |
| 22.16666666666669 | 0.86 |
| 22.183333333333355 | 0.85 |
| 22.20000000000002 | 0.84 |
| 22.216666666666686 | 0.83 |
| 22.233333333333352 | 0.83 |
| 22.250000000000018 | 0.82 |
| 22.266666666666683 | 0.81 |
| 22.28333333333335 | 0.8 |
| 22.300000000000015 | 0.8 |
| 22.31666666666668 | 0.79 |
| 22.333333333333346 | 0.79 |
| 22.350000000000012 | 0.78 |
| 22.366666666666678 | 0.77 |
| 22.383333333333344 | 0.77 |
| 22.40000000000001 | 0.76 |
| 22.416666666666675 | 0.76 |
| 22.43333333333334 | 0.75 |
| 22.450000000000006 | 0.75 |
| 22.466666666666672 | 0.75 |
| 22.483333333333338 | 0.74 |
| 22.500000000000004 | 0.74 |
| 22.51666666666667 | 0.74 |
| 22.533333333333335 | 0.73 |
| 22.55 | 0.73 |
| 22.566666666666666 | 0.73 |
| 22.583333333333332 | 0.72 |
| 22.599999999999998 | 0.72 |
| 22.616666666666664 | 0.72 |
| 22.63333333333333 | 0.72 |
| 22.649999999999995 | 0.71 |
| 22.66666666666666 | 0.71 |
| 22.683333333333326 | 0.71 |
| 22.699999999999992 | 0.71 |
| 22.716666666666658 | 0.71 |
| 22.733333333333324 | 0.71 |
| 22.74999999999999 | 0.71 |
| 22.766666666666655 | 0.71 |
| 22.78333333333332 | 0.71 |
| 22.799999999999986 | 0.71 |
| 22.816666666666652 | 0.71 |
| 22.833333333333318 | 0.71 |
| 22.849999999999984 | 0.71 |
| 22.86666666666665 | 0.71 |
| 22.883333333333315 | 0.71 |
| 22.89999999999998 | 0.71 |
| 22.916666666666647 | 0.71 |
| 22.933333333333312 | 0.71 |
| 22.949999999999978 | 0.71 |
| 22.966666666666644 | 0.71 |
| 22.98333333333331 | 0.71 |
| 22.999999999999975 | 0.71 |
| 23.01666666666664 | 0.7 |
| 23.033333333333307 | 0.69 |
| 23.049999999999972 | 0.68 |
| 23.066666666666638 | 0.66 |
| 23.083333333333304 | 0.64 |
| 23.09999999999997 | 0.63 |
| 23.116666666666635 | 0.61 |
| 23.1333333333333 | 0.59 |
| 23.149999999999967 | 0.58 |
| 23.166666666666632 | 0.56 |
| 23.183333333333298 | 0.54 |
| 23.199999999999964 | 0.53 |
| 23.21666666666663 | 0.51 |
| 23.233333333333295 | 0.5 |
| 23.24999999999996 | 0.49 |
| 23.266666666666627 | 0.47 |
| 23.283333333333292 | 0.46 |
| 23.299999999999958 | 0.45 |
| 23.316666666666624 | 0.44 |
| 23.33333333333329 | 0.43 |
| 23.349999999999955 | 0.42 |
| 23.36666666666662 | 0.42 |
| 23.383333333333287 | 0.41 |
| 23.399999999999952 | 0.4 |
| 23.416666666666618 | 0.4 |
| 23.433333333333284 | 0.39 |
| 23.44999999999995 | 0.38 |
| 23.466666666666615 | 0.38 |
| 23.48333333333328 | 0.38 |
| 23.499999999999947 | 0.37 |
| 23.516666666666612 | 0.37 |
| 23.533333333333278 | 0.36 |
| 23.549999999999944 | 0.36 |
| 23.56666666666661 | 0.36 |
| 23.583333333333275 | 0.36 |
| 23.59999999999994 | 0.35 |
| 23.616666666666607 | 0.35 |
| 23.633333333333272 | 0.35 |
| 23.649999999999938 | 0.35 |
| 23.666666666666604 | 0.35 |
| 23.68333333333327 | 0.35 |
| 23.699999999999935 | 0.35 |
| 23.7166666666666 | 0.35 |
| 23.733333333333267 | 0.35 |
| 23.749999999999932 | 0.35 |
| 23.766666666666598 | 0.35 |
| 23.783333333333264 | 0.35 |
| 23.79999999999993 | 0.35 |
| 23.816666666666595 | 0.35 |
| 23.83333333333326 | 0.35 |
| 23.849999999999927 | 0.35 |
| 23.866666666666593 | 0.35 |
| 23.88333333333326 | 0.35 |
| 23.899999999999924 | 0.35 |
| 23.91666666666659 | 0.35 |
| 23.933333333333255 | 0.35 |
| 23.94999999999992 | 0.35 |
| 23.966666666666587 | 0.35 |
| 23.983333333333253 | 0.35 |
| 23.99999999999992 | 0.35 |
| 24.016666666666584 | 0.35 |
| 24.03333333333325 | 0.36 |
| 24.049999999999915 | 0.37 |
| 24.06666666666658 | 0.38 |
| 24.083333333333247 | 0.39 |
| 24.099999999999913 | 0.4 |
| 24.11666666666658 | 0.41 |
| 24.133333333333244 | 0.43 |
| 24.14999999999991 | 0.44 |
| 24.166666666666575 | 0.44 |
| 24.18333333333324 | 0.45 |
| 24.199999999999907 | 0.46 |
| 24.216666666666573 | 0.47 |
| 24.23333333333324 | 0.47 |
| 24.249999999999904 | 0.48 |
| 24.26666666666657 | 0.48 |
| 24.283333333333236 | 0.49 |
| 24.2999999999999 | 0.49 |
| 24.316666666666567 | 0.5 |
| 24.333333333333233 | 0.5 |
| 24.3499999999999 | 0.5 |
| 24.366666666666564 | 0.51 |
| 24.38333333333323 | 0.51 |
| 24.399999999999896 | 0.51 |
| 24.41666666666656 | 0.51 |
| 24.433333333333227 | 0.51 |
| 24.449999999999893 | 0.51 |
| 24.46666666666656 | 0.51 |
| 24.483333333333224 | 0.51 |
| 24.49999999999989 | 0.51 |
| 24.516666666666556 | 0.51 |
| 24.53333333333322 | 0.51 |
| 24.549999999999887 | 0.51 |
| 24.566666666666553 | 0.51 |
| 24.58333333333322 | 0.51 |
| 24.599999999999884 | 0.51 |
| 24.61666666666655 | 0.51 |
| 24.633333333333216 | 0.51 |
| 24.64999999999988 | 0.51 |
| 24.666666666666547 | 0.51 |
| 24.683333333333213 | 0.51 |
| 24.69999999999988 | 0.51 |
| 24.716666666666544 | 0.51 |
| 24.73333333333321 | 0.51 |
| 24.749999999999876 | 0.51 |
| 24.76666666666654 | 0.51 |
| 24.783333333333207 | 0.51 |
| 24.799999999999873 | 0.51 |
| 24.81666666666654 | 0.51 |
| 24.833333333333204 | 0.51 |
| 24.84999999999987 | 0.51 |
| 24.866666666666536 | 0.51 |
| 24.8833333333332 | 0.51 |
| 24.899999999999867 | 0.51 |
| 24.916666666666533 | 0.51 |
| 24.9333333333332 | 0.51 |
| 24.949999999999864 | 0.51 |
| 24.96666666666653 | 0.51 |
| 24.983333333333196 | 0.51 |
| 24.99999999999986 | 0.51 |